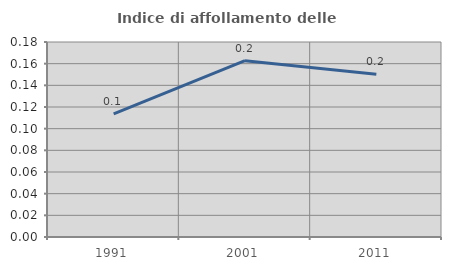
| Category | Indice di affollamento delle abitazioni  |
|---|---|
| 1991.0 | 0.114 |
| 2001.0 | 0.163 |
| 2011.0 | 0.15 |